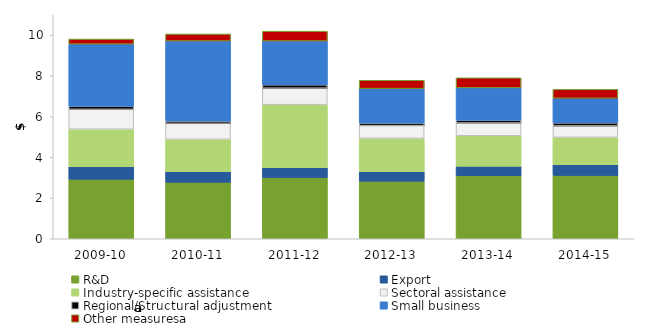
| Category | R&D | Export | Industry-specific assistance | Sectoral assistance | Regional/Structural adjustment | Small business | Other measuresa |
|---|---|---|---|---|---|---|---|
| 2009-10 | 2.922 | 0.613 | 1.845 | 0.974 | 0.154 | 3.052 | 0.249 |
| 2010-11 | 2.775 | 0.517 | 1.596 | 0.777 | 0.118 | 3.931 | 0.345 |
| 2011-12 | 3.009 | 0.487 | 3.089 | 0.808 | 0.168 | 2.152 | 0.48 |
| 2012-13 | 2.829 | 0.464 | 1.638 | 0.622 | 0.135 | 1.683 | 0.412 |
| 2013-14 | 3.096 | 0.462 | 1.501 | 0.623 | 0.141 | 1.587 | 0.492 |
| 2014-15 | 3.112 | 0.528 | 1.34 | 0.559 | 0.154 | 1.21 | 0.434 |